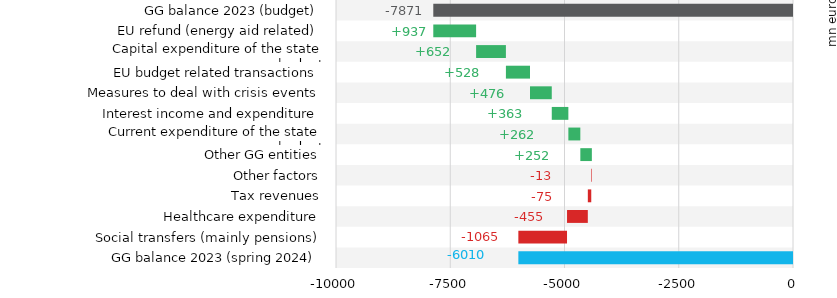
| Category | Series 3 | Series 4 |
|---|---|---|
| 0 | -10000 | 0 |
| 1 | 0 | 0 |
| 2 | -10000 | 0 |
| 3 | 0 | 0 |
| 4 | -10000 | 0 |
| 5 | 0 | 0 |
| 6 | -10000 | 0 |
| 7 | 0 | 0 |
| 8 | -10000 | 0 |
| 9 | 0 | 0 |
| 10 | -10000 | 0 |
| 11 | 0 | 0 |
| 12 | -10000 | 0 |